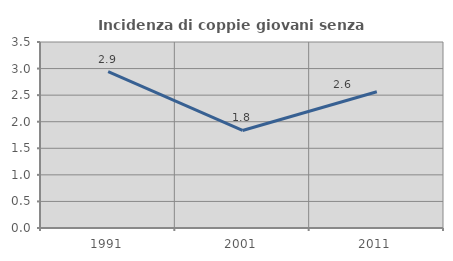
| Category | Incidenza di coppie giovani senza figli |
|---|---|
| 1991.0 | 2.941 |
| 2001.0 | 1.835 |
| 2011.0 | 2.564 |